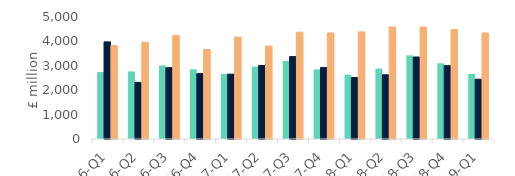
| Category | First-time
buyers | Homemovers | Homowner remortgaging |
|---|---|---|---|
| 16-Q1 | 2742.712 | 3980.381 | 3827.899 |
| 16-Q2 | 2770.191 | 2320.074 | 3966.283 |
| 16-Q3 | 3014.212 | 2923.647 | 4237.307 |
| 16-Q4 | 2856.788 | 2677.609 | 3670.023 |
| 17-Q1 | 2669.071 | 2658.067 | 4175.16 |
| 17-Q2 | 2966.031 | 3014.72 | 3809.016 |
| 17-Q3 | 3195.939 | 3376.675 | 4377.59 |
| 17-Q4 | 2850.447 | 2929.678 | 4346.57 |
| 18-Q1 | 2637.853 | 2521.875 | 4390.714 |
| 18-Q2 | 2886.116 | 2632.518 | 4592.689 |
| 18-Q3 | 3426.505 | 3360.306 | 4591.474 |
| 18-Q4 | 3102.975 | 3006.197 | 4490.901 |
| 19-Q1 | 2666.242 | 2450.406 | 4343.986 |